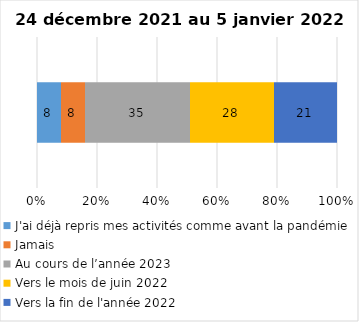
| Category | J'ai déjà repris mes activités comme avant la pandémie | Jamais | Au cours de l’année 2023 | Vers le mois de juin 2022 | Vers la fin de l'année 2022 |
|---|---|---|---|---|---|
| 0 | 8 | 8 | 35 | 28 | 21 |